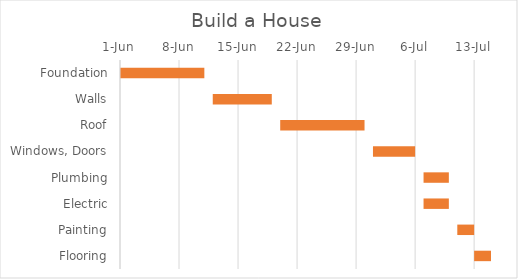
| Category | Start Date | Duration |
|---|---|---|
| Foundation | 2017-06-01 | 10 |
| Walls | 2017-06-12 | 7 |
| Roof | 2017-06-20 | 10 |
| Windows, Doors | 2017-07-01 | 5 |
| Plumbing | 2017-07-07 | 3 |
| Electric | 2017-07-07 | 3 |
| Painting | 2017-07-11 | 2 |
| Flooring | 2017-07-13 | 2 |